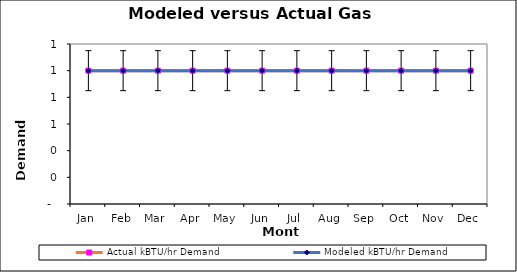
| Category | Actual kBTU/hr Demand | Modeled kBTU/hr Demand |
|---|---|---|
| 0 | 1 | 1 |
| 1900-01-01 | 1 | 1 |
| 1900-01-02 | 1 | 1 |
| 1900-01-03 | 1 | 1 |
| 1900-01-04 | 1 | 1 |
| 1900-01-05 | 1 | 1 |
| 1900-01-06 | 1 | 1 |
| 1900-01-07 | 1 | 1 |
| 1900-01-08 | 1 | 1 |
| 1900-01-09 | 1 | 1 |
| 1900-01-10 | 1 | 1 |
| 1900-01-11 | 1 | 1 |